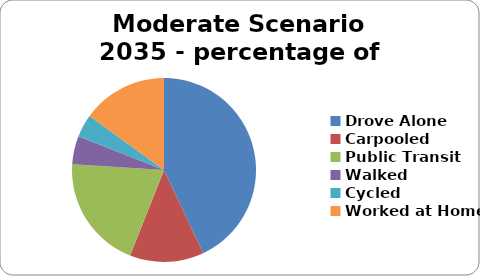
| Category | Moderate Scenario 2035 - percentage of VMTs |
|---|---|
| Drove Alone | 0.43 |
| Carpooled | 0.13 |
| Public Transit | 0.2 |
| Walked | 0.05 |
| Cycled | 0.04 |
| Worked at Home | 0.15 |